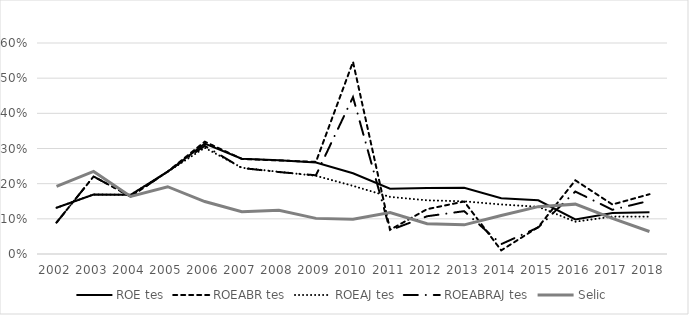
| Category | ROE tes | ROEABR tes | ROEAJ tes | ROEABRAJ tes | Selic |
|---|---|---|---|---|---|
| 2002.0 | 0.132 | 0.089 | 0.132 | 0.089 | 0.192 |
| 2003.0 | 0.169 | 0.22 | 0.169 | 0.22 | 0.235 |
| 2004.0 | 0.168 | 0.163 | 0.168 | 0.163 | 0.164 |
| 2005.0 | 0.234 | 0.234 | 0.234 | 0.234 | 0.191 |
| 2006.0 | 0.314 | 0.319 | 0.302 | 0.308 | 0.149 |
| 2007.0 | 0.271 | 0.27 | 0.245 | 0.245 | 0.12 |
| 2008.0 | 0.267 | 0.266 | 0.234 | 0.233 | 0.124 |
| 2009.0 | 0.26 | 0.262 | 0.222 | 0.224 | 0.101 |
| 2010.0 | 0.23 | 0.546 | 0.194 | 0.446 | 0.099 |
| 2011.0 | 0.186 | 0.069 | 0.162 | 0.068 | 0.118 |
| 2012.0 | 0.188 | 0.128 | 0.153 | 0.107 | 0.086 |
| 2013.0 | 0.188 | 0.149 | 0.15 | 0.122 | 0.083 |
| 2014.0 | 0.158 | 0.01 | 0.141 | 0.028 | 0.11 |
| 2015.0 | 0.153 | 0.077 | 0.134 | 0.076 | 0.135 |
| 2016.0 | 0.098 | 0.21 | 0.092 | 0.178 | 0.142 |
| 2017.0 | 0.116 | 0.141 | 0.106 | 0.126 | 0.101 |
| 2018.0 | 0.119 | 0.17 | 0.106 | 0.151 | 0.064 |